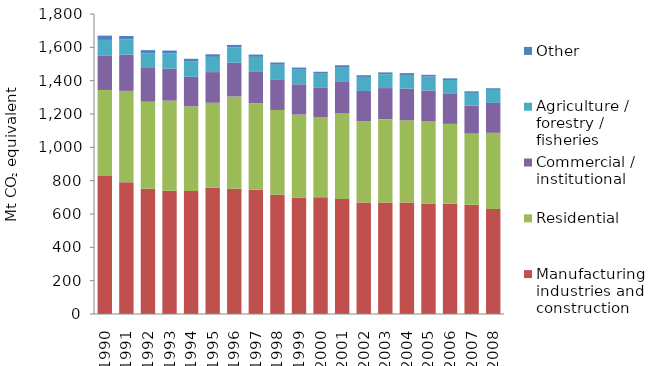
| Category | Manufacturing industries and construction | Residential | Commercial / institutional | Agriculture / forestry / fisheries | Other |
|---|---|---|---|---|---|
| 1990 | 828.677 | 515.53 | 207.656 | 92.693 | 25.67 |
| 1991 | 790.775 | 548.019 | 217.209 | 90.828 | 21.267 |
| 1992 | 750.999 | 522.791 | 202.436 | 88.213 | 18.871 |
| 1993 | 739.233 | 541.258 | 191.471 | 91.344 | 17.541 |
| 1994 | 737.768 | 507.585 | 177.712 | 91.221 | 16.835 |
| 1995 | 756.842 | 510.554 | 184.037 | 91.35 | 15.525 |
| 1996 | 751.714 | 553.308 | 202.334 | 93.005 | 14.259 |
| 1997 | 744.909 | 519.785 | 187.663 | 90.503 | 13.824 |
| 1998 | 714.944 | 509.234 | 184.016 | 87.363 | 13.444 |
| 1999 | 698.899 | 497.8 | 181.714 | 87.457 | 12.854 |
| 2000 | 700.235 | 481.921 | 174.647 | 84.715 | 11.911 |
| 2001 | 689.384 | 514.477 | 192.354 | 85.826 | 10.611 |
| 2002 | 669.054 | 487.254 | 181.869 | 84.231 | 10.452 |
| 2003 | 669.036 | 500.203 | 186.359 | 83.325 | 10.712 |
| 2004 | 669.34 | 492.829 | 189.679 | 82.544 | 11.206 |
| 2005 | 663.175 | 491.927 | 186.201 | 82.964 | 10.772 |
| 2006 | 661.277 | 479.445 | 183.48 | 79.747 | 9.978 |
| 2007 | 656.23 | 426.614 | 167.187 | 76.551 | 9.683 |
| 2008 | 629.329 | 457.851 | 179.337 | 78.324 | 9.527 |